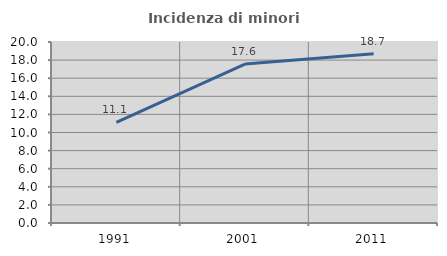
| Category | Incidenza di minori stranieri |
|---|---|
| 1991.0 | 11.111 |
| 2001.0 | 17.568 |
| 2011.0 | 18.702 |